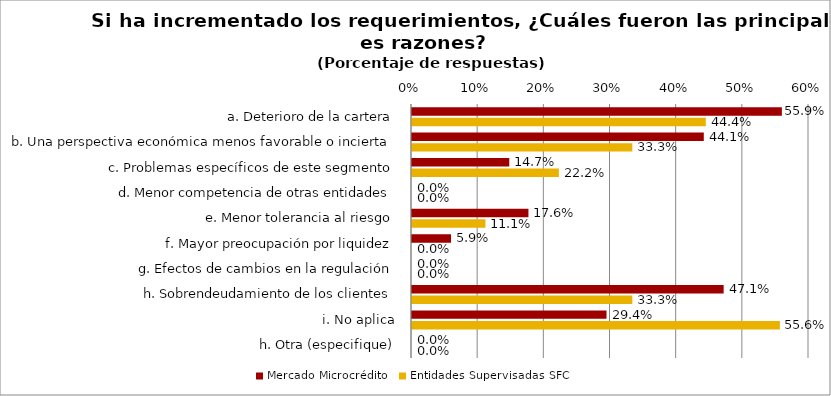
| Category | Mercado Microcrédito | Entidades Supervisadas SFC |
|---|---|---|
| a. Deterioro de la cartera | 0.559 | 0.444 |
| b. Una perspectiva económica menos favorable o incierta | 0.441 | 0.333 |
| c. Problemas específicos de este segmento | 0.147 | 0.222 |
| d. Menor competencia de otras entidades | 0 | 0 |
| e. Menor tolerancia al riesgo | 0.176 | 0.111 |
| f. Mayor preocupación por liquidez | 0.059 | 0 |
| g. Efectos de cambios en la regulación | 0 | 0 |
| h. Sobrendeudamiento de los clientes | 0.471 | 0.333 |
| i. No aplica | 0.294 | 0.556 |
| h. Otra (especifique) | 0 | 0 |